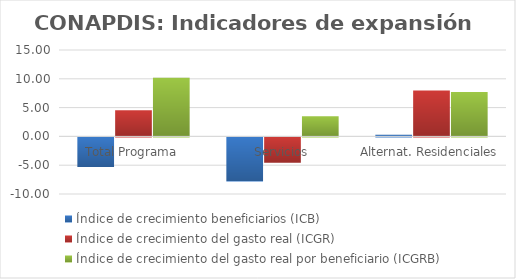
| Category | Índice de crecimiento beneficiarios (ICB)  | Índice de crecimiento del gasto real (ICGR)  | Índice de crecimiento del gasto real por beneficiario (ICGRB)  |
|---|---|---|---|
| Total Programa | -5.127 | 4.551 | 10.201 |
| Servicios | -7.656 | -4.411 | 3.515 |
| Alternat. Residenciales | 0.272 | 7.986 | 7.692 |